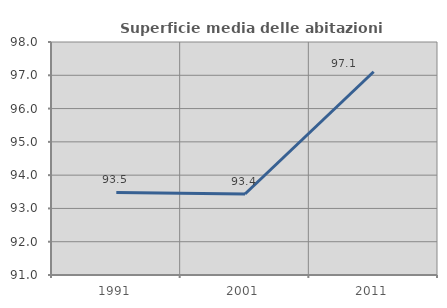
| Category | Superficie media delle abitazioni occupate |
|---|---|
| 1991.0 | 93.48 |
| 2001.0 | 93.434 |
| 2011.0 | 97.106 |